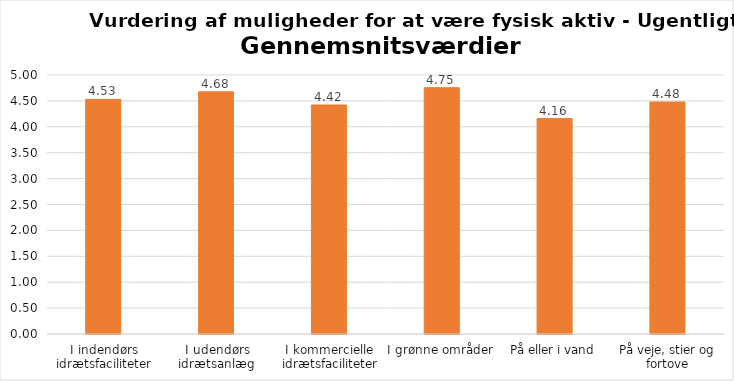
| Category | Gennemsnit |
|---|---|
| I indendørs idrætsfaciliteter | 4.53 |
| I udendørs idrætsanlæg | 4.676 |
| I kommercielle idrætsfaciliteter | 4.421 |
| I grønne områder | 4.755 |
| På eller i vand | 4.159 |
| På veje, stier og fortove | 4.478 |